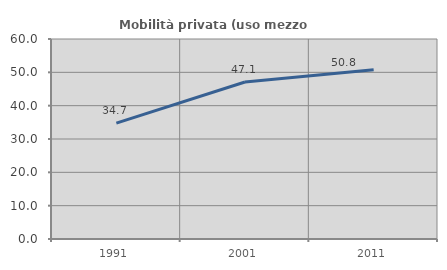
| Category | Mobilità privata (uso mezzo privato) |
|---|---|
| 1991.0 | 34.744 |
| 2001.0 | 47.109 |
| 2011.0 | 50.759 |